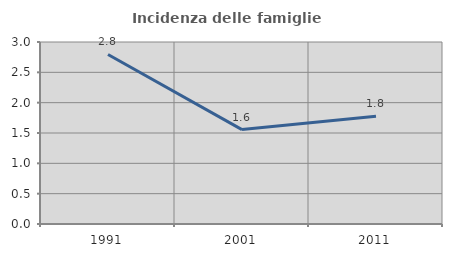
| Category | Incidenza delle famiglie numerose |
|---|---|
| 1991.0 | 2.794 |
| 2001.0 | 1.556 |
| 2011.0 | 1.774 |